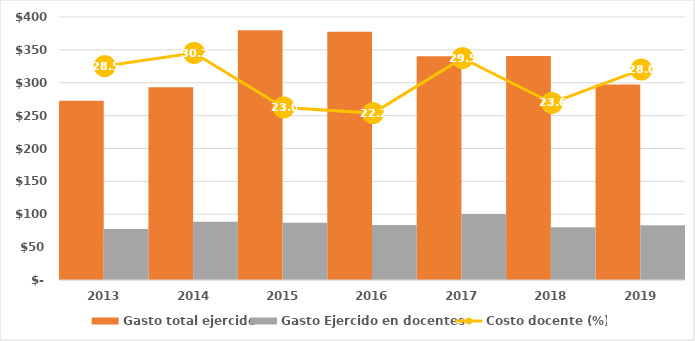
| Category | Gasto total ejercido | Gasto Ejercido en docentes |
|---|---|---|
| 2013 | 272702.822 | 77627.479 |
| 2014 | 293113.7 | 88540.243 |
| 2015 | 380021.6 | 87260.674 |
| 2016 | 377416.6 | 83826.519 |
| 2017 | 340334.7 | 100494.157 |
| 2018 | 340765 | 80275.926 |
| 2019 | 297383.7 | 83288.235 |